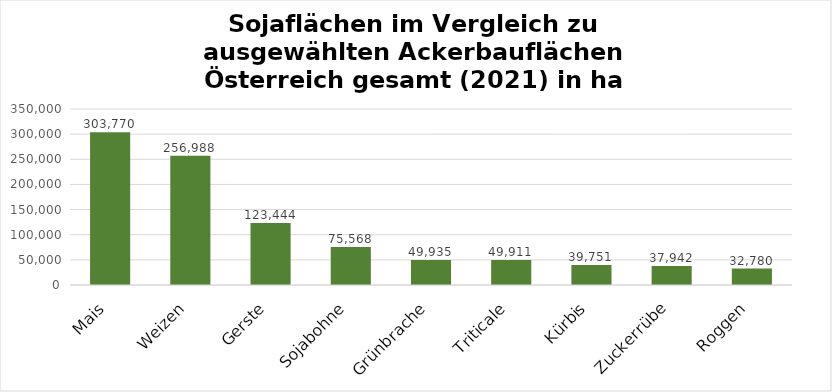
| Category | Series 0 |
|---|---|
| Mais | 303770 |
| Weizen | 256988 |
| Gerste | 123444 |
| Sojabohne | 75568 |
| Grünbrache | 49935 |
| Triticale | 49911 |
| Kürbis | 39751 |
| Zuckerrübe | 37942 |
| Roggen | 32780 |